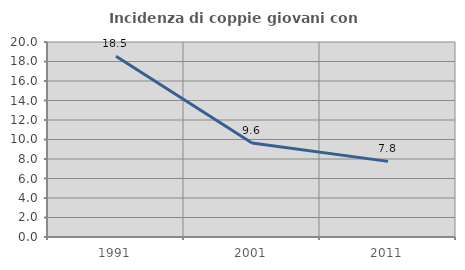
| Category | Incidenza di coppie giovani con figli |
|---|---|
| 1991.0 | 18.529 |
| 2001.0 | 9.633 |
| 2011.0 | 7.755 |